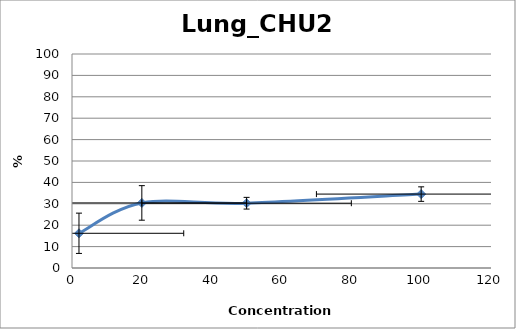
| Category | Lung_CHU2 |
|---|---|
| 100.0 | 34.538 |
| 50.0 | 30.272 |
| 20.0 | 30.409 |
| 2.0 | 16.223 |
| nan | 0 |
| nan | 0 |
| nan | 0 |
| nan | 0 |
| nan | 0 |